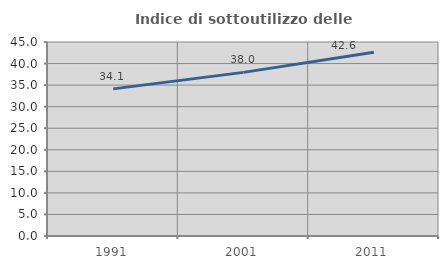
| Category | Indice di sottoutilizzo delle abitazioni  |
|---|---|
| 1991.0 | 34.125 |
| 2001.0 | 37.952 |
| 2011.0 | 42.634 |